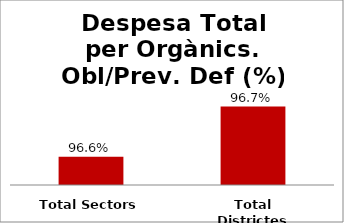
| Category | Series 0 |
|---|---|
| Total Sectors | 0.966 |
| Total Districtes | 0.967 |